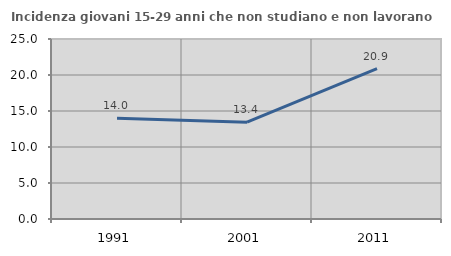
| Category | Incidenza giovani 15-29 anni che non studiano e non lavorano  |
|---|---|
| 1991.0 | 13.986 |
| 2001.0 | 13.449 |
| 2011.0 | 20.892 |